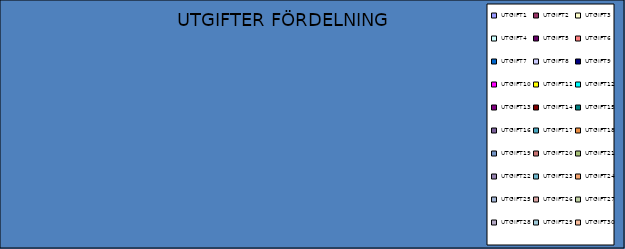
| Category | UTGIFTER FÖRDELNING |
|---|---|
| UTGIFT1 | 0 |
| UTGIFT2 | 0 |
| UTGIFT3 | 0 |
| UTGIFT4 | 0 |
| UTGIFT5 | 0 |
| UTGIFT6 | 0 |
| UTGIFT7 | 0 |
| UTGIFT8 | 0 |
| UTGIFT9 | 0 |
| UTGIFT10 | 0 |
| UTGIFT11 | 0 |
| UTGIFT12 | 0 |
| UTGIFT13 | 0 |
| UTGIFT14 | 0 |
| UTGIFT15 | 0 |
| UTGIFT16 | 0 |
| UTGIFT17 | 0 |
| UTGIFT18 | 0 |
| UTGIFT19 | 0 |
| UTGIFT20 | 0 |
| UTGIFT21 | 0 |
| UTGIFT22 | 0 |
| UTGIFT23 | 0 |
| UTGIFT24 | 0 |
| UTGIFT25 | 0 |
| UTGIFT26 | 0 |
| UTGIFT27 | 0 |
| UTGIFT28 | 0 |
| UTGIFT29 | 0 |
| UTGIFT30 | 0 |